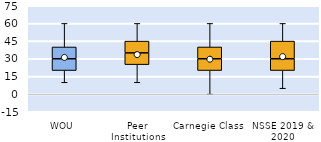
| Category | 25th | 50th | 75th |
|---|---|---|---|
| WOU | 20 | 10 | 10 |
| Peer Institutions | 25 | 10 | 10 |
| Carnegie Class | 20 | 10 | 10 |
| NSSE 2019 & 2020 | 20 | 10 | 15 |